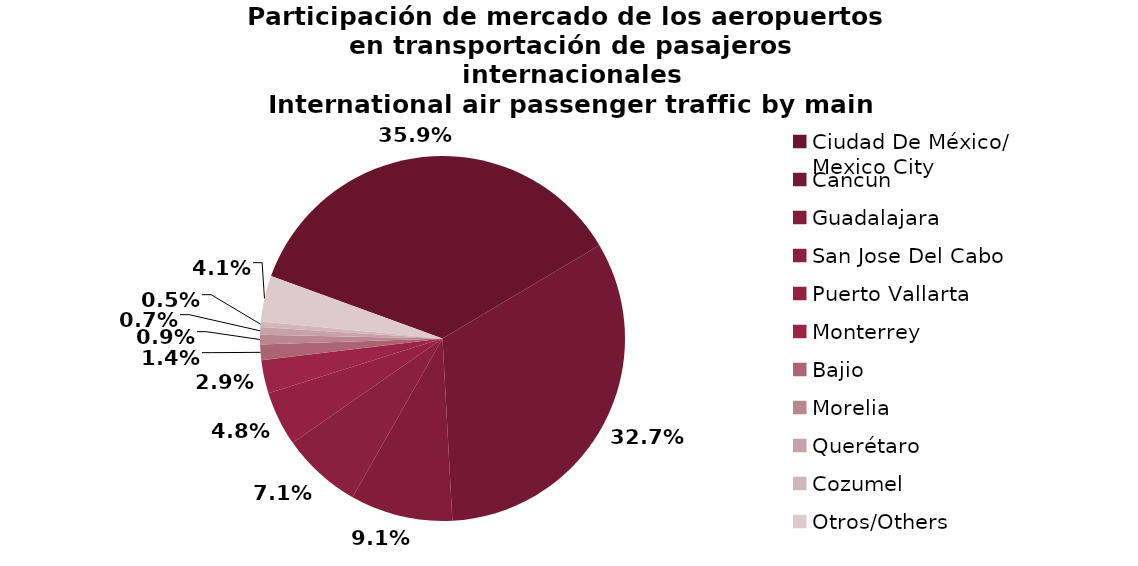
| Category | Series 0 |
|---|---|
| Ciudad De México/
Mexico City | 1458.486 |
| Cancun | 1327.014 |
| Guadalajara | 367.989 |
| San Jose Del Cabo | 289.047 |
| Puerto Vallarta | 196.685 |
| Monterrey | 119.469 |
| Bajio | 56.136 |
| Morelia | 34.727 |
| Querétaro | 27.023 |
| Cozumel | 19.919 |
| Otros/Others | 164.979 |